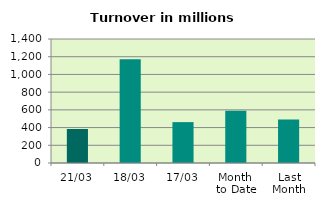
| Category | Series 0 |
|---|---|
| 21/03 | 383.779 |
| 18/03 | 1170.457 |
| 17/03 | 461.563 |
| Month 
to Date | 589.931 |
| Last
Month | 490.433 |